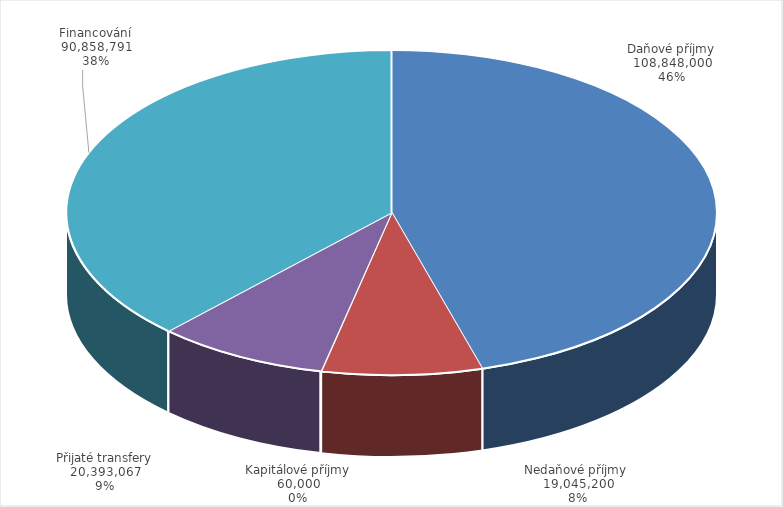
| Category | Series 0 |
|---|---|
| Daňové příjmy | 108848000 |
| Nedaňové příjmy  | 19045200 |
| Kapitálové příjmy | 60000 |
| Přijaté transfery | 20393067 |
| Financování | 90858791 |